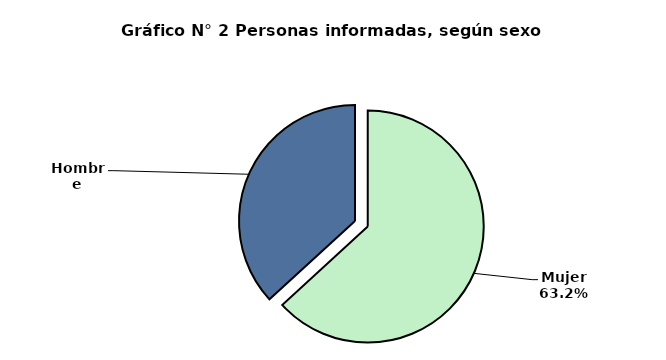
| Category | 204,495 |
|---|---|
| Mujer | 204495 |
| Hombre | 119064 |